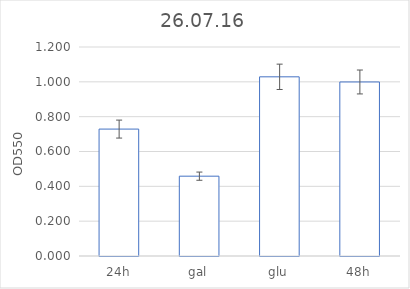
| Category | Series 0 |
|---|---|
| 24h | 0.729 |
| gal | 0.458 |
| glu | 1.029 |
| 48h | 0.999 |